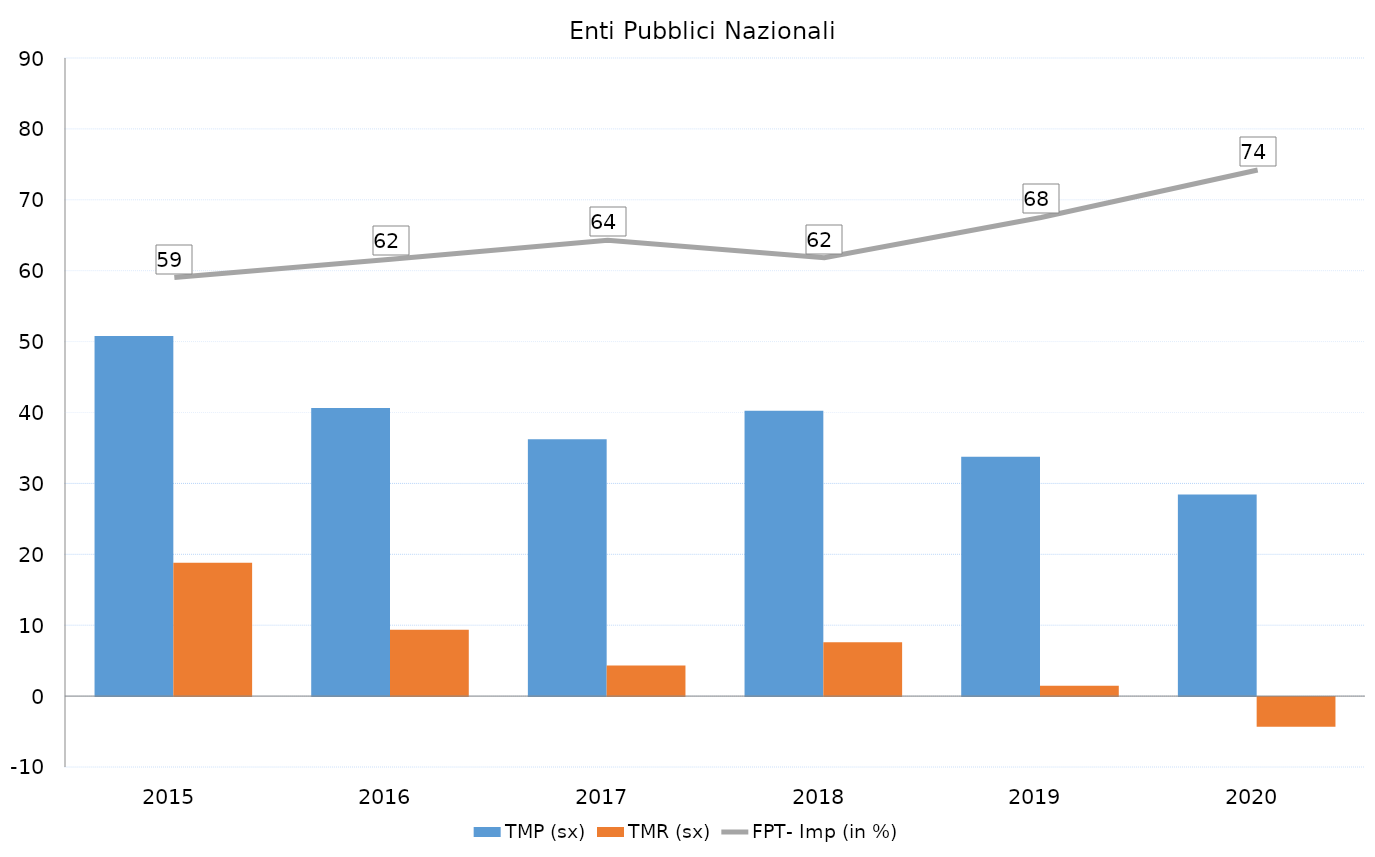
| Category | TMP (sx) | TMR (sx) |
|---|---|---|
| 2015.0 | 50.802 | 18.826 |
| 2016.0 | 40.634 | 9.348 |
| 2017.0 | 36.231 | 4.317 |
| 2018.0 | 40.254 | 7.601 |
| 2019.0 | 33.762 | 1.443 |
| 2020.0 | 28.422 | -4.171 |